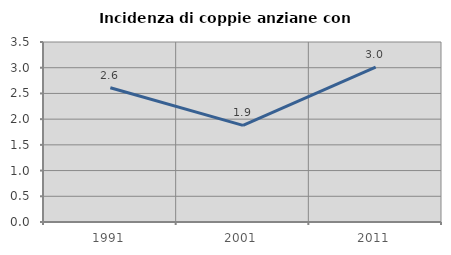
| Category | Incidenza di coppie anziane con figli |
|---|---|
| 1991.0 | 2.611 |
| 2001.0 | 1.878 |
| 2011.0 | 3.009 |